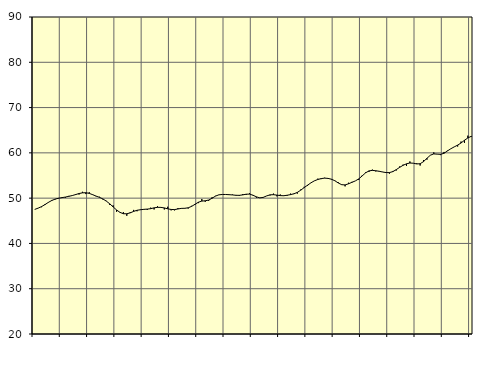
| Category | Piggar | Samtliga anställda (inkl. anställda utomlands) |
|---|---|---|
| nan | 47.5 | 47.51 |
| 87.0 | 47.8 | 47.79 |
| 87.0 | 48 | 48.13 |
| 87.0 | 48.7 | 48.57 |
| nan | 49 | 49.06 |
| 88.0 | 49.6 | 49.48 |
| 88.0 | 49.7 | 49.79 |
| 88.0 | 49.9 | 49.98 |
| nan | 50.2 | 50.11 |
| 89.0 | 50.1 | 50.24 |
| 89.0 | 50.5 | 50.4 |
| 89.0 | 50.6 | 50.57 |
| nan | 50.9 | 50.79 |
| 90.0 | 50.8 | 51.02 |
| 90.0 | 51.4 | 51.17 |
| 90.0 | 50.9 | 51.2 |
| nan | 51.3 | 51.05 |
| 91.0 | 50.7 | 50.76 |
| 91.0 | 50.4 | 50.45 |
| 91.0 | 50.3 | 50.17 |
| nan | 49.7 | 49.82 |
| 92.0 | 49.4 | 49.34 |
| 92.0 | 48.5 | 48.75 |
| 92.0 | 48.4 | 48.06 |
| nan | 47 | 47.39 |
| 93.0 | 46.9 | 46.86 |
| 93.0 | 46.9 | 46.56 |
| 93.0 | 46.1 | 46.55 |
| nan | 46.9 | 46.75 |
| 94.0 | 47.4 | 47.07 |
| 94.0 | 47.1 | 47.32 |
| 94.0 | 47.5 | 47.44 |
| nan | 47.6 | 47.53 |
| 95.0 | 47.4 | 47.58 |
| 95.0 | 47.9 | 47.67 |
| 95.0 | 47.5 | 47.86 |
| nan | 48.2 | 47.97 |
| 96.0 | 47.9 | 47.96 |
| 96.0 | 47.5 | 47.84 |
| 96.0 | 48.1 | 47.64 |
| nan | 47.3 | 47.5 |
| 97.0 | 47.3 | 47.47 |
| 97.0 | 47.8 | 47.61 |
| 97.0 | 47.8 | 47.74 |
| nan | 47.7 | 47.76 |
| 98.0 | 47.7 | 47.87 |
| 98.0 | 48.3 | 48.18 |
| 98.0 | 48.5 | 48.64 |
| nan | 48.9 | 49.1 |
| 99.0 | 49.8 | 49.35 |
| 99.0 | 49.2 | 49.42 |
| 99.0 | 49.4 | 49.58 |
| nan | 50.2 | 49.97 |
| 0.0 | 50.5 | 50.45 |
| 0.0 | 50.7 | 50.73 |
| 0.0 | 50.8 | 50.81 |
| nan | 50.8 | 50.81 |
| 1.0 | 50.7 | 50.76 |
| 1.0 | 50.8 | 50.71 |
| 1.0 | 50.7 | 50.63 |
| nan | 50.5 | 50.62 |
| 2.0 | 50.9 | 50.72 |
| 2.0 | 50.7 | 50.87 |
| 2.0 | 51.1 | 50.89 |
| nan | 50.7 | 50.64 |
| 3.0 | 50.1 | 50.29 |
| 3.0 | 50.1 | 50.06 |
| 3.0 | 50.1 | 50.17 |
| nan | 50.5 | 50.49 |
| 4.0 | 50.6 | 50.73 |
| 4.0 | 51 | 50.76 |
| 4.0 | 50.4 | 50.67 |
| nan | 50.8 | 50.56 |
| 5.0 | 50.6 | 50.53 |
| 5.0 | 50.5 | 50.64 |
| 5.0 | 51 | 50.78 |
| nan | 50.9 | 50.96 |
| 6.0 | 51 | 51.27 |
| 6.0 | 51.9 | 51.76 |
| 6.0 | 52.5 | 52.33 |
| nan | 52.7 | 52.86 |
| 7.0 | 53.4 | 53.39 |
| 7.0 | 53.8 | 53.82 |
| 7.0 | 54.3 | 54.12 |
| nan | 54.2 | 54.32 |
| 8.0 | 54.5 | 54.42 |
| 8.0 | 54.3 | 54.36 |
| 8.0 | 54.1 | 54.18 |
| nan | 53.9 | 53.84 |
| 9.0 | 53.5 | 53.35 |
| 9.0 | 52.9 | 52.97 |
| 9.0 | 52.6 | 52.92 |
| nan | 53.4 | 53.17 |
| 10.0 | 53.6 | 53.49 |
| 10.0 | 53.8 | 53.8 |
| 10.0 | 54 | 54.25 |
| nan | 55 | 54.9 |
| 11.0 | 55.7 | 55.58 |
| 11.0 | 55.8 | 56.02 |
| 11.0 | 56.3 | 56.13 |
| nan | 55.9 | 56.05 |
| 12.0 | 56 | 55.93 |
| 12.0 | 55.8 | 55.77 |
| 12.0 | 55.6 | 55.65 |
| nan | 55.4 | 55.64 |
| 13.0 | 56 | 55.86 |
| 13.0 | 56.1 | 56.3 |
| 13.0 | 57 | 56.8 |
| nan | 57.4 | 57.25 |
| 14.0 | 57.1 | 57.58 |
| 14.0 | 58.1 | 57.76 |
| 14.0 | 57.7 | 57.71 |
| nan | 57.7 | 57.55 |
| 15.0 | 57.2 | 57.6 |
| 15.0 | 58.4 | 58.07 |
| 15.0 | 58.5 | 58.8 |
| nan | 59.5 | 59.48 |
| 16.0 | 60.1 | 59.77 |
| 16.0 | 59.7 | 59.72 |
| 16.0 | 59.5 | 59.67 |
| nan | 60.2 | 59.91 |
| 17.0 | 60.5 | 60.42 |
| 17.0 | 60.9 | 60.91 |
| 17.0 | 61.3 | 61.32 |
| nan | 61.4 | 61.71 |
| 18.0 | 62.5 | 62.18 |
| 18.0 | 62.2 | 62.78 |
| 18.0 | 63.8 | 63.29 |
| nan | 63.5 | 63.66 |